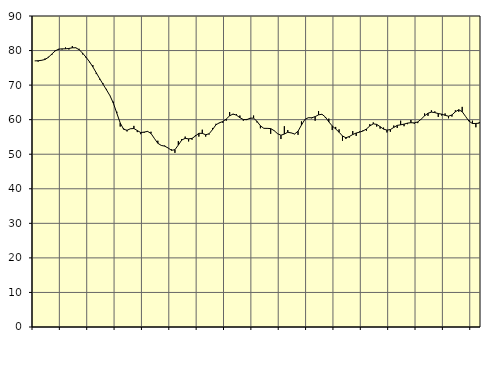
| Category | Piggar | Series 1 |
|---|---|---|
| nan | 77 | 77.01 |
| 87.0 | 76.8 | 77.05 |
| 87.0 | 77.1 | 77.18 |
| 87.0 | 77.7 | 77.41 |
| nan | 78.2 | 78.04 |
| 88.0 | 78.7 | 78.99 |
| 88.0 | 80.1 | 79.9 |
| 88.0 | 80.2 | 80.42 |
| nan | 80.3 | 80.49 |
| 89.0 | 80.9 | 80.5 |
| 89.0 | 80.3 | 80.61 |
| 89.0 | 81.3 | 80.8 |
| nan | 80.9 | 80.8 |
| 90.0 | 80.5 | 80.25 |
| 90.0 | 78.9 | 79.25 |
| 90.0 | 77.9 | 78.09 |
| nan | 76.6 | 76.79 |
| 91.0 | 75.8 | 75.27 |
| 91.0 | 73.2 | 73.56 |
| 91.0 | 71.6 | 71.87 |
| nan | 70.5 | 70.22 |
| 92.0 | 68.9 | 68.61 |
| 92.0 | 67 | 66.95 |
| 92.0 | 65.2 | 64.77 |
| nan | 62.3 | 61.89 |
| 93.0 | 58 | 59.05 |
| 93.0 | 57.5 | 57.22 |
| 93.0 | 56.6 | 56.93 |
| nan | 57.4 | 57.37 |
| 94.0 | 58.2 | 57.44 |
| 94.0 | 56.4 | 56.85 |
| 94.0 | 55.8 | 56.27 |
| nan | 56.2 | 56.4 |
| 95.0 | 56.5 | 56.61 |
| 95.0 | 56.5 | 56.01 |
| 95.0 | 54.6 | 54.56 |
| nan | 53.9 | 53.17 |
| 96.0 | 52.5 | 52.55 |
| 96.0 | 52.5 | 52.34 |
| 96.0 | 51.8 | 51.81 |
| nan | 51.4 | 51.13 |
| 97.0 | 50.4 | 51.31 |
| 97.0 | 53.8 | 52.66 |
| 97.0 | 54.4 | 54.11 |
| nan | 55.1 | 54.59 |
| 98.0 | 53.7 | 54.44 |
| 98.0 | 54.2 | 54.58 |
| 98.0 | 55.5 | 55.27 |
| nan | 55.1 | 56.06 |
| 99.0 | 57.1 | 56.03 |
| 99.0 | 55.1 | 55.64 |
| 99.0 | 55.7 | 55.92 |
| nan | 57.6 | 57.13 |
| 0.0 | 58.8 | 58.52 |
| 0.0 | 59 | 59.09 |
| 0.0 | 59.1 | 59.46 |
| nan | 59.7 | 60.18 |
| 1.0 | 62.2 | 61.11 |
| 1.0 | 61.5 | 61.64 |
| 1.0 | 61.6 | 61.3 |
| nan | 61.2 | 60.58 |
| 2.0 | 59.7 | 60.04 |
| 2.0 | 60.2 | 60 |
| 2.0 | 60.3 | 60.44 |
| nan | 61.2 | 60.44 |
| 3.0 | 59.2 | 59.51 |
| 3.0 | 57.5 | 58.22 |
| 3.0 | 57.5 | 57.49 |
| nan | 57.4 | 57.48 |
| 4.0 | 55.9 | 57.42 |
| 4.0 | 56.9 | 56.83 |
| 4.0 | 56 | 55.95 |
| nan | 54.4 | 55.49 |
| 5.0 | 58.1 | 55.84 |
| 5.0 | 57 | 56.36 |
| 5.0 | 56.2 | 56.16 |
| nan | 55.8 | 55.86 |
| 6.0 | 55.6 | 56.66 |
| 6.0 | 59.5 | 58.44 |
| 6.0 | 60 | 60.06 |
| nan | 60.6 | 60.56 |
| 7.0 | 60.4 | 60.55 |
| 7.0 | 59.7 | 60.88 |
| 7.0 | 62.5 | 61.4 |
| nan | 61.5 | 61.57 |
| 8.0 | 60.5 | 60.75 |
| 8.0 | 60.3 | 59.36 |
| 8.0 | 57 | 58.18 |
| nan | 57.9 | 57.31 |
| 9.0 | 57.2 | 56.37 |
| 9.0 | 53.9 | 55.28 |
| 9.0 | 54.4 | 54.77 |
| nan | 54.8 | 55.13 |
| 10.0 | 56.7 | 55.7 |
| 10.0 | 55.3 | 56.14 |
| 10.0 | 56.6 | 56.39 |
| nan | 56.9 | 56.72 |
| 11.0 | 56.8 | 57.3 |
| 11.0 | 58.7 | 58.18 |
| 11.0 | 59.2 | 58.8 |
| nan | 58 | 58.63 |
| 12.0 | 57.4 | 57.98 |
| 12.0 | 57.7 | 57.27 |
| 12.0 | 56.3 | 56.97 |
| nan | 56.5 | 57.14 |
| 13.0 | 58.3 | 57.76 |
| 13.0 | 57.6 | 58.34 |
| 13.0 | 59.7 | 58.51 |
| nan | 58.1 | 58.71 |
| 14.0 | 58.7 | 59 |
| 14.0 | 59.9 | 59.12 |
| 14.0 | 58.8 | 59.07 |
| nan | 59 | 59.34 |
| 15.0 | 60.1 | 60.14 |
| 15.0 | 61.8 | 61.11 |
| 15.0 | 61.1 | 61.86 |
| nan | 62.7 | 62.19 |
| 16.0 | 62.4 | 62.04 |
| 16.0 | 60.8 | 61.77 |
| 16.0 | 61.2 | 61.6 |
| nan | 61.8 | 61.26 |
| 17.0 | 60.4 | 61.01 |
| 17.0 | 60.9 | 61.37 |
| 17.0 | 62.7 | 62.28 |
| nan | 62.3 | 62.88 |
| 18.0 | 63.7 | 62.3 |
| 18.0 | 60.9 | 60.92 |
| 18.0 | 59.9 | 59.55 |
| nan | 59.7 | 58.89 |
| 19.0 | 57.8 | 58.9 |
| 19.0 | 59.3 | 58.99 |